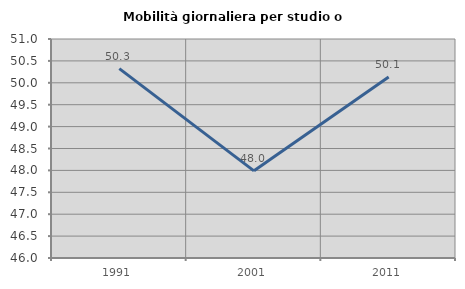
| Category | Mobilità giornaliera per studio o lavoro |
|---|---|
| 1991.0 | 50.324 |
| 2001.0 | 47.99 |
| 2011.0 | 50.131 |